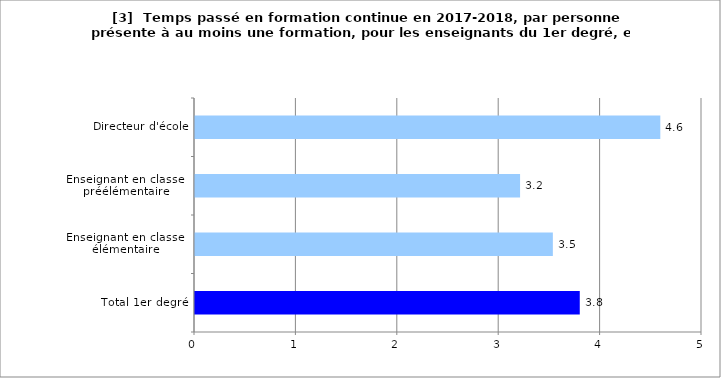
| Category | Series 0 |
|---|---|
| Total 1er degré | 3.795 |
| Enseignant en classe 
élémentaire | 3.529 |
| Enseignant en classe 
préélémentaire | 3.206 |
| Directeur d'école | 4.589 |